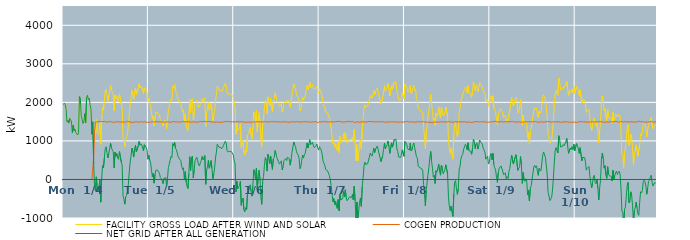
| Category | FACILITY GROSS LOAD AFTER WIND AND SOLAR | COGEN PRODUCTION | NET GRID AFTER ALL GENERATION |
|---|---|---|---|
|  Mon  1/4 | 1943 | 0 | 1943 |
|  Mon  1/4 | 1981 | 0 | 1981 |
|  Mon  1/4 | 1942 | 0 | 1942 |
|  Mon  1/4 | 1819 | 0 | 1819 |
|  Mon  1/4 | 1489 | 0 | 1489 |
|  Mon  1/4 | 1533 | 0 | 1533 |
|  Mon  1/4 | 1461 | 0 | 1461 |
|  Mon  1/4 | 1584 | 0 | 1584 |
|  Mon  1/4 | 1547 | 0 | 1547 |
|  Mon  1/4 | 1512 | 0 | 1512 |
|  Mon  1/4 | 1209 | 0 | 1209 |
|  Mon  1/4 | 1408 | 0 | 1408 |
|  Mon  1/4 | 1260 | 0 | 1260 |
|  Mon  1/4 | 1304 | 0 | 1304 |
|  Mon  1/4 | 1218 | 0 | 1218 |
|  Mon  1/4 | 1212 | 0 | 1212 |
|  Mon  1/4 | 1155 | 0 | 1155 |
|  Mon  1/4 | 1210 | 0 | 1210 |
|  Mon  1/4 | 2149 | 0 | 2149 |
|  Mon  1/4 | 2100 | 0 | 2100 |
|  Mon  1/4 | 1655 | 0 | 1655 |
|  Mon  1/4 | 1634 | 0 | 1634 |
|  Mon  1/4 | 1451 | 0 | 1451 |
|  Mon  1/4 | 1500 | 0 | 1500 |
|  Mon  1/4 | 1708 | 0 | 1708 |
|  Mon  1/4 | 1472 | 0 | 1472 |
|  Mon  1/4 | 2118 | 0 | 2118 |
|  Mon  1/4 | 2185 | 0 | 2185 |
|  Mon  1/4 | 2074 | 0 | 2074 |
|  Mon  1/4 | 2108 | 0 | 2108 |
|  Mon  1/4 | 1933 | 0 | 1933 |
|  Mon  1/4 | 1821 | 0 | 1821 |
|  Mon  1/4 | 1171 | 0 | 1171 |
|  Mon  1/4 | 1495 | 0 | 1495 |
|  Mon  1/4 | 968 | 569 | 399 |
|  Mon  1/4 | 1035 | 1241 | -206 |
|  Mon  1/4 | 1197 | 1493 | -296 |
|  Mon  1/4 | 1559 | 1492 | 67 |
|  Mon  1/4 | 1215 | 1492 | -277 |
|  Mon  1/4 | 1163 | 1483 | -320 |
|  Mon  1/4 | 1201 | 1503 | -302 |
|  Mon  1/4 | 1474 | 1488 | -14 |
|  Mon  1/4 | 913 | 1502 | -589 |
|  Mon  1/4 | 1516 | 1486 | 30 |
|  Mon  1/4 | 1859 | 1499 | 360 |
|  Mon  1/4 | 1804 | 1495 | 309 |
|  Mon  1/4 | 2060 | 1506 | 554 |
|  Mon  1/4 | 2291 | 1493 | 798 |
|  Mon  1/4 | 2342 | 1494 | 848 |
|  Mon  1/4 | 2186 | 1491 | 695 |
|  Mon  1/4 | 2044 | 1485 | 559 |
|  Mon  1/4 | 2167 | 1493 | 674 |
|  Mon  1/4 | 2313 | 1506 | 807 |
|  Mon  1/4 | 2437 | 1499 | 938 |
|  Mon  1/4 | 2317 | 1494 | 823 |
|  Mon  1/4 | 2259 | 1501 | 758 |
|  Mon  1/4 | 2210 | 1481 | 729 |
|  Mon  1/4 | 1786 | 1488 | 298 |
|  Mon  1/4 | 2192 | 1487 | 705 |
|  Mon  1/4 | 2101 | 1500 | 601 |
|  Mon  1/4 | 2171 | 1499 | 672 |
|  Mon  1/4 | 2043 | 1483 | 560 |
|  Mon  1/4 | 2013 | 1493 | 520 |
|  Mon  1/4 | 2217 | 1494 | 723 |
|  Mon  1/4 | 2227 | 1486 | 741 |
|  Mon  1/4 | 1943 | 1489 | 454 |
|  Mon  1/4 | 1866 | 1492 | 374 |
|  Mon  1/4 | 1063 | 1482 | -419 |
|  Mon  1/4 | 987 | 1490 | -503 |
|  Mon  1/4 | 854 | 1495 | -641 |
|  Mon  1/4 | 1037 | 1487 | -450 |
|  Mon  1/4 | 1081 | 1492 | -411 |
|  Mon  1/4 | 1192 | 1508 | -316 |
|  Mon  1/4 | 1377 | 1499 | -122 |
|  Mon  1/4 | 1683 | 1494 | 189 |
|  Mon  1/4 | 1945 | 1502 | 443 |
|  Mon  1/4 | 2094 | 1487 | 607 |
|  Mon  1/4 | 2314 | 1498 | 816 |
|  Mon  1/4 | 2200 | 1480 | 720 |
|  Mon  1/4 | 2082 | 1501 | 581 |
|  Mon  1/4 | 2287 | 1489 | 798 |
|  Mon  1/4 | 2370 | 1485 | 885 |
|  Mon  1/4 | 2208 | 1496 | 712 |
|  Mon  1/4 | 2210 | 1483 | 727 |
|  Mon  1/4 | 2348 | 1481 | 867 |
|  Mon  1/4 | 2483 | 1494 | 989 |
|  Mon  1/4 | 2385 | 1497 | 888 |
|  Mon  1/4 | 2424 | 1495 | 929 |
|  Mon  1/4 | 2398 | 1497 | 901 |
|  Mon  1/4 | 2387 | 1491 | 896 |
|  Mon  1/4 | 2230 | 1488 | 742 |
|  Mon  1/4 | 2383 | 1482 | 901 |
|  Mon  1/4 | 2368 | 1497 | 871 |
|  Mon  1/4 | 2318 | 1488 | 830 |
|  Mon  1/4 | 2249 | 1483 | 766 |
|  Mon  1/4 | 2010 | 1485 | 525 |
|  Tue  1/5 | 2107 | 1483 | 624 |
|  Tue  1/5 | 1995 | 1490 | 505 |
|  Tue  1/5 | 1912 | 1483 | 429 |
|  Tue  1/5 | 1746 | 1492 | 254 |
|  Tue  1/5 | 1574 | 1503 | 71 |
|  Tue  1/5 | 1646 | 1488 | 158 |
|  Tue  1/5 | 1389 | 1485 | -96 |
|  Tue  1/5 | 1621 | 1494 | 127 |
|  Tue  1/5 | 1748 | 1504 | 244 |
|  Tue  1/5 | 1724 | 1488 | 236 |
|  Tue  1/5 | 1736 | 1497 | 239 |
|  Tue  1/5 | 1753 | 1490 | 263 |
|  Tue  1/5 | 1646 | 1490 | 156 |
|  Tue  1/5 | 1551 | 1502 | 49 |
|  Tue  1/5 | 1515 | 1493 | 22 |
|  Tue  1/5 | 1477 | 1497 | -20 |
|  Tue  1/5 | 1382 | 1490 | -108 |
|  Tue  1/5 | 1512 | 1489 | 23 |
|  Tue  1/5 | 1498 | 1486 | 12 |
|  Tue  1/5 | 1541 | 1490 | 51 |
|  Tue  1/5 | 1313 | 1493 | -180 |
|  Tue  1/5 | 1518 | 1496 | 22 |
|  Tue  1/5 | 1808 | 1500 | 308 |
|  Tue  1/5 | 1899 | 1505 | 394 |
|  Tue  1/5 | 1982 | 1480 | 502 |
|  Tue  1/5 | 2091 | 1492 | 599 |
|  Tue  1/5 | 2063 | 1492 | 571 |
|  Tue  1/5 | 2422 | 1492 | 930 |
|  Tue  1/5 | 2372 | 1501 | 871 |
|  Tue  1/5 | 2459 | 1493 | 966 |
|  Tue  1/5 | 2305 | 1495 | 810 |
|  Tue  1/5 | 2256 | 1484 | 772 |
|  Tue  1/5 | 2181 | 1492 | 689 |
|  Tue  1/5 | 2064 | 1473 | 591 |
|  Tue  1/5 | 2064 | 1489 | 575 |
|  Tue  1/5 | 2012 | 1493 | 519 |
|  Tue  1/5 | 1974 | 1489 | 485 |
|  Tue  1/5 | 1841 | 1495 | 346 |
|  Tue  1/5 | 1758 | 1500 | 258 |
|  Tue  1/5 | 1806 | 1503 | 303 |
|  Tue  1/5 | 1496 | 1498 | -2 |
|  Tue  1/5 | 1696 | 1494 | 202 |
|  Tue  1/5 | 1420 | 1490 | -70 |
|  Tue  1/5 | 1311 | 1491 | -180 |
|  Tue  1/5 | 1267 | 1502 | -235 |
|  Tue  1/5 | 1651 | 1498 | 153 |
|  Tue  1/5 | 2078 | 1488 | 590 |
|  Tue  1/5 | 1731 | 1498 | 233 |
|  Tue  1/5 | 2054 | 1486 | 568 |
|  Tue  1/5 | 2097 | 1491 | 606 |
|  Tue  1/5 | 1537 | 1497 | 40 |
|  Tue  1/5 | 1743 | 1498 | 245 |
|  Tue  1/5 | 1980 | 1492 | 488 |
|  Tue  1/5 | 1997 | 1496 | 501 |
|  Tue  1/5 | 2059 | 1482 | 577 |
|  Tue  1/5 | 2079 | 1494 | 585 |
|  Tue  1/5 | 1871 | 1489 | 382 |
|  Tue  1/5 | 1848 | 1498 | 350 |
|  Tue  1/5 | 1942 | 1502 | 440 |
|  Tue  1/5 | 1994 | 1500 | 494 |
|  Tue  1/5 | 2093 | 1498 | 595 |
|  Tue  1/5 | 2005 | 1492 | 513 |
|  Tue  1/5 | 2080 | 1510 | 570 |
|  Tue  1/5 | 2117 | 1497 | 620 |
|  Tue  1/5 | 1373 | 1499 | -126 |
|  Tue  1/5 | 1734 | 1498 | 236 |
|  Tue  1/5 | 1831 | 1498 | 333 |
|  Tue  1/5 | 1994 | 1496 | 498 |
|  Tue  1/5 | 1797 | 1506 | 291 |
|  Tue  1/5 | 1858 | 1491 | 367 |
|  Tue  1/5 | 1982 | 1491 | 491 |
|  Tue  1/5 | 1790 | 1502 | 288 |
|  Tue  1/5 | 1513 | 1494 | 19 |
|  Tue  1/5 | 1640 | 1506 | 134 |
|  Tue  1/5 | 1784 | 1485 | 299 |
|  Tue  1/5 | 2048 | 1491 | 557 |
|  Tue  1/5 | 2197 | 1487 | 710 |
|  Tue  1/5 | 2412 | 1500 | 912 |
|  Tue  1/5 | 2429 | 1494 | 935 |
|  Tue  1/5 | 2319 | 1486 | 833 |
|  Tue  1/5 | 2337 | 1482 | 855 |
|  Tue  1/5 | 2318 | 1487 | 831 |
|  Tue  1/5 | 2278 | 1484 | 794 |
|  Tue  1/5 | 2314 | 1487 | 827 |
|  Tue  1/5 | 2376 | 1491 | 885 |
|  Tue  1/5 | 2383 | 1497 | 886 |
|  Tue  1/5 | 2494 | 1500 | 994 |
|  Tue  1/5 | 2440 | 1489 | 951 |
|  Tue  1/5 | 2254 | 1504 | 750 |
|  Tue  1/5 | 2210 | 1495 | 715 |
|  Tue  1/5 | 2214 | 1503 | 711 |
|  Tue  1/5 | 2224 | 1495 | 729 |
|  Tue  1/5 | 2214 | 1490 | 724 |
|  Tue  1/5 | 2203 | 1484 | 719 |
|  Tue  1/5 | 2217 | 1501 | 716 |
|  Tue  1/5 | 2134 | 1500 | 634 |
|  Wed  1/6 | 1971 | 1487 | 484 |
|  Wed  1/6 | 1899 | 1494 | 405 |
|  Wed  1/6 | 1172 | 1497 | -325 |
|  Wed  1/6 | 1456 | 1504 | -48 |
|  Wed  1/6 | 1258 | 1499 | -241 |
|  Wed  1/6 | 1253 | 1481 | -228 |
|  Wed  1/6 | 1337 | 1494 | -157 |
|  Wed  1/6 | 1450 | 1496 | -46 |
|  Wed  1/6 | 825 | 1496 | -671 |
|  Wed  1/6 | 953 | 1492 | -539 |
|  Wed  1/6 | 1012 | 1497 | -485 |
|  Wed  1/6 | 702 | 1493 | -791 |
|  Wed  1/6 | 637 | 1480 | -843 |
|  Wed  1/6 | 762 | 1493 | -731 |
|  Wed  1/6 | 708 | 1487 | -779 |
|  Wed  1/6 | 1150 | 1504 | -354 |
|  Wed  1/6 | 1184 | 1488 | -304 |
|  Wed  1/6 | 1251 | 1495 | -244 |
|  Wed  1/6 | 1348 | 1488 | -140 |
|  Wed  1/6 | 1178 | 1489 | -311 |
|  Wed  1/6 | 1050 | 1483 | -433 |
|  Wed  1/6 | 1342 | 1504 | -162 |
|  Wed  1/6 | 1747 | 1495 | 252 |
|  Wed  1/6 | 1665 | 1494 | 171 |
|  Wed  1/6 | 1488 | 1493 | -5 |
|  Wed  1/6 | 1787 | 1500 | 287 |
|  Wed  1/6 | 1230 | 1498 | -268 |
|  Wed  1/6 | 1580 | 1507 | 73 |
|  Wed  1/6 | 1739 | 1498 | 241 |
|  Wed  1/6 | 1515 | 1494 | 21 |
|  Wed  1/6 | 1049 | 1489 | -440 |
|  Wed  1/6 | 852 | 1498 | -646 |
|  Wed  1/6 | 1440 | 1491 | -51 |
|  Wed  1/6 | 1576 | 1502 | 74 |
|  Wed  1/6 | 1862 | 1501 | 361 |
|  Wed  1/6 | 2052 | 1489 | 563 |
|  Wed  1/6 | 1997 | 1493 | 504 |
|  Wed  1/6 | 1706 | 1490 | 216 |
|  Wed  1/6 | 2143 | 1492 | 651 |
|  Wed  1/6 | 2071 | 1501 | 570 |
|  Wed  1/6 | 1908 | 1495 | 413 |
|  Wed  1/6 | 2108 | 1499 | 609 |
|  Wed  1/6 | 1886 | 1501 | 385 |
|  Wed  1/6 | 1756 | 1496 | 260 |
|  Wed  1/6 | 2034 | 1498 | 536 |
|  Wed  1/6 | 2073 | 1505 | 568 |
|  Wed  1/6 | 2247 | 1496 | 751 |
|  Wed  1/6 | 2155 | 1491 | 664 |
|  Wed  1/6 | 2063 | 1497 | 566 |
|  Wed  1/6 | 2069 | 1487 | 582 |
|  Wed  1/6 | 1943 | 1497 | 446 |
|  Wed  1/6 | 1897 | 1498 | 399 |
|  Wed  1/6 | 1925 | 1481 | 444 |
|  Wed  1/6 | 1962 | 1479 | 483 |
|  Wed  1/6 | 1753 | 1503 | 250 |
|  Wed  1/6 | 1820 | 1489 | 331 |
|  Wed  1/6 | 1977 | 1489 | 488 |
|  Wed  1/6 | 1986 | 1498 | 488 |
|  Wed  1/6 | 2038 | 1495 | 543 |
|  Wed  1/6 | 1981 | 1491 | 490 |
|  Wed  1/6 | 2067 | 1491 | 576 |
|  Wed  1/6 | 2074 | 1486 | 588 |
|  Wed  1/6 | 2019 | 1482 | 537 |
|  Wed  1/6 | 1870 | 1499 | 371 |
|  Wed  1/6 | 2014 | 1494 | 520 |
|  Wed  1/6 | 2202 | 1505 | 697 |
|  Wed  1/6 | 2192 | 1496 | 696 |
|  Wed  1/6 | 2474 | 1502 | 972 |
|  Wed  1/6 | 2390 | 1488 | 902 |
|  Wed  1/6 | 2350 | 1501 | 849 |
|  Wed  1/6 | 2232 | 1501 | 731 |
|  Wed  1/6 | 2156 | 1489 | 667 |
|  Wed  1/6 | 2128 | 1494 | 634 |
|  Wed  1/6 | 2044 | 1493 | 551 |
|  Wed  1/6 | 1777 | 1494 | 283 |
|  Wed  1/6 | 1828 | 1492 | 336 |
|  Wed  1/6 | 1981 | 1485 | 496 |
|  Wed  1/6 | 2124 | 1490 | 634 |
|  Wed  1/6 | 2059 | 1501 | 558 |
|  Wed  1/6 | 2132 | 1489 | 643 |
|  Wed  1/6 | 2182 | 1494 | 688 |
|  Wed  1/6 | 2158 | 1487 | 671 |
|  Wed  1/6 | 2441 | 1493 | 948 |
|  Wed  1/6 | 2327 | 1510 | 817 |
|  Wed  1/6 | 2413 | 1495 | 918 |
|  Wed  1/6 | 2523 | 1493 | 1030 |
|  Wed  1/6 | 2386 | 1483 | 903 |
|  Wed  1/6 | 2426 | 1496 | 930 |
|  Wed  1/6 | 2467 | 1496 | 971 |
|  Wed  1/6 | 2377 | 1492 | 885 |
|  Wed  1/6 | 2321 | 1492 | 829 |
|  Wed  1/6 | 2344 | 1490 | 854 |
|  Wed  1/6 | 2371 | 1501 | 870 |
|  Wed  1/6 | 2422 | 1504 | 918 |
|  Wed  1/6 | 2290 | 1471 | 819 |
|  Wed  1/6 | 2247 | 1487 | 760 |
|  Thu  1/7 | 2349 | 1499 | 850 |
|  Thu  1/7 | 2305 | 1501 | 804 |
|  Thu  1/7 | 2242 | 1487 | 755 |
|  Thu  1/7 | 2140 | 1493 | 647 |
|  Thu  1/7 | 1971 | 1503 | 468 |
|  Thu  1/7 | 1954 | 1490 | 464 |
|  Thu  1/7 | 1856 | 1495 | 361 |
|  Thu  1/7 | 1755 | 1497 | 258 |
|  Thu  1/7 | 1743 | 1495 | 248 |
|  Thu  1/7 | 1722 | 1496 | 226 |
|  Thu  1/7 | 1741 | 1492 | 249 |
|  Thu  1/7 | 1607 | 1504 | 103 |
|  Thu  1/7 | 1494 | 1490 | 4 |
|  Thu  1/7 | 1334 | 1489 | -155 |
|  Thu  1/7 | 1140 | 1499 | -359 |
|  Thu  1/7 | 931 | 1505 | -574 |
|  Thu  1/7 | 989 | 1487 | -498 |
|  Thu  1/7 | 839 | 1487 | -648 |
|  Thu  1/7 | 942 | 1501 | -559 |
|  Thu  1/7 | 796 | 1489 | -693 |
|  Thu  1/7 | 748 | 1501 | -753 |
|  Thu  1/7 | 973 | 1495 | -522 |
|  Thu  1/7 | 699 | 1512 | -813 |
|  Thu  1/7 | 1115 | 1495 | -380 |
|  Thu  1/7 | 963 | 1496 | -533 |
|  Thu  1/7 | 979 | 1491 | -512 |
|  Thu  1/7 | 989 | 1489 | -500 |
|  Thu  1/7 | 1183 | 1487 | -304 |
|  Thu  1/7 | 1045 | 1496 | -451 |
|  Thu  1/7 | 1224 | 1491 | -267 |
|  Thu  1/7 | 1021 | 1491 | -470 |
|  Thu  1/7 | 945 | 1497 | -552 |
|  Thu  1/7 | 935 | 1510 | -575 |
|  Thu  1/7 | 1016 | 1498 | -482 |
|  Thu  1/7 | 1052 | 1500 | -448 |
|  Thu  1/7 | 1023 | 1491 | -468 |
|  Thu  1/7 | 1025 | 1496 | -471 |
|  Thu  1/7 | 1098 | 1486 | -388 |
|  Thu  1/7 | 971 | 1501 | -530 |
|  Thu  1/7 | 1298 | 1475 | -177 |
|  Thu  1/7 | 941 | 1492 | -551 |
|  Thu  1/7 | 485 | 1490 | -1005 |
|  Thu  1/7 | 912 | 1497 | -585 |
|  Thu  1/7 | 478 | 1491 | -1013 |
|  Thu  1/7 | 653 | 1479 | -826 |
|  Thu  1/7 | 890 | 1482 | -592 |
|  Thu  1/7 | 1018 | 1497 | -479 |
|  Thu  1/7 | 791 | 1490 | -699 |
|  Thu  1/7 | 1292 | 1479 | -187 |
|  Thu  1/7 | 1558 | 1499 | 59 |
|  Thu  1/7 | 1846 | 1496 | 350 |
|  Thu  1/7 | 1940 | 1491 | 449 |
|  Thu  1/7 | 1870 | 1480 | 390 |
|  Thu  1/7 | 1858 | 1488 | 370 |
|  Thu  1/7 | 1896 | 1492 | 404 |
|  Thu  1/7 | 1899 | 1507 | 392 |
|  Thu  1/7 | 2067 | 1492 | 575 |
|  Thu  1/7 | 2184 | 1500 | 684 |
|  Thu  1/7 | 2206 | 1501 | 705 |
|  Thu  1/7 | 2107 | 1502 | 605 |
|  Thu  1/7 | 2195 | 1498 | 697 |
|  Thu  1/7 | 2302 | 1494 | 808 |
|  Thu  1/7 | 2200 | 1501 | 699 |
|  Thu  1/7 | 2281 | 1493 | 788 |
|  Thu  1/7 | 2271 | 1490 | 781 |
|  Thu  1/7 | 2367 | 1498 | 869 |
|  Thu  1/7 | 2382 | 1490 | 892 |
|  Thu  1/7 | 2162 | 1494 | 668 |
|  Thu  1/7 | 2139 | 1488 | 651 |
|  Thu  1/7 | 1960 | 1499 | 461 |
|  Thu  1/7 | 1965 | 1500 | 465 |
|  Thu  1/7 | 2115 | 1500 | 615 |
|  Thu  1/7 | 2272 | 1493 | 779 |
|  Thu  1/7 | 2430 | 1484 | 946 |
|  Thu  1/7 | 2290 | 1495 | 795 |
|  Thu  1/7 | 2302 | 1487 | 815 |
|  Thu  1/7 | 2386 | 1485 | 901 |
|  Thu  1/7 | 2490 | 1491 | 999 |
|  Thu  1/7 | 2346 | 1490 | 856 |
|  Thu  1/7 | 2164 | 1488 | 676 |
|  Thu  1/7 | 2188 | 1490 | 698 |
|  Thu  1/7 | 2446 | 1496 | 950 |
|  Thu  1/7 | 2342 | 1503 | 839 |
|  Thu  1/7 | 2338 | 1497 | 841 |
|  Thu  1/7 | 2524 | 1491 | 1033 |
|  Thu  1/7 | 2535 | 1488 | 1047 |
|  Thu  1/7 | 2532 | 1491 | 1041 |
|  Thu  1/7 | 2283 | 1491 | 792 |
|  Thu  1/7 | 2213 | 1490 | 723 |
|  Thu  1/7 | 2070 | 1487 | 583 |
|  Thu  1/7 | 2077 | 1498 | 579 |
|  Thu  1/7 | 2062 | 1494 | 568 |
|  Thu  1/7 | 2120 | 1489 | 631 |
|  Thu  1/7 | 2249 | 1482 | 767 |
|  Thu  1/7 | 2238 | 1489 | 749 |
|  Thu  1/7 | 2093 | 1493 | 600 |
|  Fri  1/8 | 2480 | 1492 | 988 |
|  Fri  1/8 | 2470 | 1496 | 974 |
|  Fri  1/8 | 2409 | 1488 | 921 |
|  Fri  1/8 | 2304 | 1506 | 798 |
|  Fri  1/8 | 2266 | 1493 | 773 |
|  Fri  1/8 | 2249 | 1486 | 763 |
|  Fri  1/8 | 2434 | 1491 | 943 |
|  Fri  1/8 | 2231 | 1494 | 737 |
|  Fri  1/8 | 2262 | 1497 | 765 |
|  Fri  1/8 | 2383 | 1496 | 887 |
|  Fri  1/8 | 2441 | 1493 | 948 |
|  Fri  1/8 | 2308 | 1482 | 826 |
|  Fri  1/8 | 2338 | 1500 | 838 |
|  Fri  1/8 | 2082 | 1492 | 590 |
|  Fri  1/8 | 2044 | 1493 | 551 |
|  Fri  1/8 | 1839 | 1495 | 344 |
|  Fri  1/8 | 1845 | 1483 | 362 |
|  Fri  1/8 | 1798 | 1495 | 303 |
|  Fri  1/8 | 1773 | 1495 | 278 |
|  Fri  1/8 | 1768 | 1493 | 275 |
|  Fri  1/8 | 1740 | 1503 | 237 |
|  Fri  1/8 | 1373 | 1502 | -129 |
|  Fri  1/8 | 1121 | 1480 | -359 |
|  Fri  1/8 | 803 | 1485 | -682 |
|  Fri  1/8 | 1211 | 1498 | -287 |
|  Fri  1/8 | 1415 | 1486 | -71 |
|  Fri  1/8 | 1633 | 1500 | 133 |
|  Fri  1/8 | 1793 | 1484 | 309 |
|  Fri  1/8 | 2067 | 1507 | 560 |
|  Fri  1/8 | 2211 | 1483 | 728 |
|  Fri  1/8 | 1950 | 1484 | 466 |
|  Fri  1/8 | 1767 | 1473 | 294 |
|  Fri  1/8 | 1546 | 1487 | 59 |
|  Fri  1/8 | 1595 | 1486 | 109 |
|  Fri  1/8 | 1390 | 1496 | -106 |
|  Fri  1/8 | 1725 | 1495 | 230 |
|  Fri  1/8 | 1687 | 1498 | 189 |
|  Fri  1/8 | 1653 | 1485 | 168 |
|  Fri  1/8 | 1879 | 1481 | 398 |
|  Fri  1/8 | 1705 | 1492 | 213 |
|  Fri  1/8 | 1598 | 1487 | 111 |
|  Fri  1/8 | 1861 | 1494 | 367 |
|  Fri  1/8 | 1811 | 1500 | 311 |
|  Fri  1/8 | 1644 | 1496 | 148 |
|  Fri  1/8 | 1670 | 1499 | 171 |
|  Fri  1/8 | 1745 | 1494 | 251 |
|  Fri  1/8 | 1878 | 1498 | 380 |
|  Fri  1/8 | 1879 | 1485 | 394 |
|  Fri  1/8 | 1638 | 1492 | 146 |
|  Fri  1/8 | 1035 | 1504 | -469 |
|  Fri  1/8 | 791 | 1491 | -700 |
|  Fri  1/8 | 680 | 1491 | -811 |
|  Fri  1/8 | 804 | 1493 | -689 |
|  Fri  1/8 | 812 | 1489 | -677 |
|  Fri  1/8 | 529 | 1487 | -958 |
|  Fri  1/8 | 1111 | 1484 | -373 |
|  Fri  1/8 | 1427 | 1498 | -71 |
|  Fri  1/8 | 1471 | 1500 | -29 |
|  Fri  1/8 | 1237 | 1488 | -251 |
|  Fri  1/8 | 1105 | 1492 | -387 |
|  Fri  1/8 | 1245 | 1494 | -249 |
|  Fri  1/8 | 1744 | 1492 | 252 |
|  Fri  1/8 | 1837 | 1503 | 334 |
|  Fri  1/8 | 2037 | 1500 | 537 |
|  Fri  1/8 | 2118 | 1500 | 618 |
|  Fri  1/8 | 2135 | 1489 | 646 |
|  Fri  1/8 | 2276 | 1492 | 784 |
|  Fri  1/8 | 2339 | 1499 | 840 |
|  Fri  1/8 | 2402 | 1491 | 911 |
|  Fri  1/8 | 2356 | 1486 | 870 |
|  Fri  1/8 | 2249 | 1482 | 767 |
|  Fri  1/8 | 2436 | 1485 | 951 |
|  Fri  1/8 | 2243 | 1493 | 750 |
|  Fri  1/8 | 2224 | 1492 | 732 |
|  Fri  1/8 | 2216 | 1495 | 721 |
|  Fri  1/8 | 2133 | 1479 | 654 |
|  Fri  1/8 | 2275 | 1482 | 793 |
|  Fri  1/8 | 2529 | 1490 | 1039 |
|  Fri  1/8 | 2478 | 1494 | 984 |
|  Fri  1/8 | 2293 | 1495 | 798 |
|  Fri  1/8 | 2412 | 1492 | 920 |
|  Fri  1/8 | 2457 | 1504 | 953 |
|  Fri  1/8 | 2281 | 1493 | 788 |
|  Fri  1/8 | 2350 | 1491 | 859 |
|  Fri  1/8 | 2513 | 1490 | 1023 |
|  Fri  1/8 | 2529 | 1491 | 1038 |
|  Fri  1/8 | 2429 | 1476 | 953 |
|  Fri  1/8 | 2417 | 1502 | 915 |
|  Fri  1/8 | 2311 | 1495 | 816 |
|  Fri  1/8 | 2295 | 1490 | 805 |
|  Fri  1/8 | 2209 | 1499 | 710 |
|  Fri  1/8 | 2019 | 1494 | 525 |
|  Fri  1/8 | 2037 | 1504 | 533 |
|  Fri  1/8 | 2082 | 1482 | 600 |
|  Fri  1/8 | 1897 | 1498 | 399 |
|  Fri  1/8 | 1930 | 1490 | 440 |
|  Sat  1/9 | 2130 | 1498 | 632 |
|  Sat  1/9 | 2167 | 1492 | 675 |
|  Sat  1/9 | 1998 | 1493 | 505 |
|  Sat  1/9 | 2171 | 1497 | 674 |
|  Sat  1/9 | 1875 | 1486 | 389 |
|  Sat  1/9 | 1812 | 1510 | 302 |
|  Sat  1/9 | 1752 | 1504 | 248 |
|  Sat  1/9 | 1556 | 1498 | 58 |
|  Sat  1/9 | 1412 | 1486 | -74 |
|  Sat  1/9 | 1663 | 1489 | 174 |
|  Sat  1/9 | 1774 | 1484 | 290 |
|  Sat  1/9 | 1809 | 1497 | 312 |
|  Sat  1/9 | 1839 | 1487 | 352 |
|  Sat  1/9 | 1836 | 1501 | 335 |
|  Sat  1/9 | 1722 | 1502 | 220 |
|  Sat  1/9 | 1613 | 1487 | 126 |
|  Sat  1/9 | 1613 | 1481 | 132 |
|  Sat  1/9 | 1668 | 1500 | 168 |
|  Sat  1/9 | 1519 | 1499 | 20 |
|  Sat  1/9 | 1569 | 1495 | 74 |
|  Sat  1/9 | 1523 | 1496 | 27 |
|  Sat  1/9 | 1712 | 1497 | 215 |
|  Sat  1/9 | 1780 | 1495 | 285 |
|  Sat  1/9 | 1972 | 1498 | 474 |
|  Sat  1/9 | 2129 | 1500 | 629 |
|  Sat  1/9 | 2152 | 1505 | 647 |
|  Sat  1/9 | 1908 | 1509 | 399 |
|  Sat  1/9 | 1909 | 1490 | 419 |
|  Sat  1/9 | 2075 | 1493 | 582 |
|  Sat  1/9 | 2133 | 1491 | 642 |
|  Sat  1/9 | 2106 | 1488 | 618 |
|  Sat  1/9 | 1730 | 1493 | 237 |
|  Sat  1/9 | 1744 | 1486 | 258 |
|  Sat  1/9 | 1823 | 1489 | 334 |
|  Sat  1/9 | 2086 | 1493 | 593 |
|  Sat  1/9 | 1871 | 1484 | 387 |
|  Sat  1/9 | 1401 | 1503 | -102 |
|  Sat  1/9 | 1670 | 1489 | 181 |
|  Sat  1/9 | 1463 | 1483 | -20 |
|  Sat  1/9 | 1448 | 1501 | -53 |
|  Sat  1/9 | 1504 | 1489 | 15 |
|  Sat  1/9 | 1445 | 1492 | -47 |
|  Sat  1/9 | 1085 | 1486 | -401 |
|  Sat  1/9 | 1218 | 1497 | -279 |
|  Sat  1/9 | 933 | 1490 | -557 |
|  Sat  1/9 | 1262 | 1497 | -235 |
|  Sat  1/9 | 1333 | 1493 | -160 |
|  Sat  1/9 | 1323 | 1494 | -171 |
|  Sat  1/9 | 1654 | 1492 | 162 |
|  Sat  1/9 | 1824 | 1497 | 327 |
|  Sat  1/9 | 1866 | 1500 | 366 |
|  Sat  1/9 | 1812 | 1505 | 307 |
|  Sat  1/9 | 1852 | 1497 | 355 |
|  Sat  1/9 | 1703 | 1489 | 214 |
|  Sat  1/9 | 1609 | 1501 | 108 |
|  Sat  1/9 | 1772 | 1482 | 290 |
|  Sat  1/9 | 1759 | 1499 | 260 |
|  Sat  1/9 | 1724 | 1497 | 227 |
|  Sat  1/9 | 1922 | 1495 | 427 |
|  Sat  1/9 | 2121 | 1484 | 637 |
|  Sat  1/9 | 2197 | 1483 | 714 |
|  Sat  1/9 | 2193 | 1495 | 698 |
|  Sat  1/9 | 2078 | 1503 | 575 |
|  Sat  1/9 | 1862 | 1493 | 369 |
|  Sat  1/9 | 1647 | 1505 | 142 |
|  Sat  1/9 | 1173 | 1508 | -335 |
|  Sat  1/9 | 1073 | 1502 | -429 |
|  Sat  1/9 | 939 | 1489 | -550 |
|  Sat  1/9 | 971 | 1484 | -513 |
|  Sat  1/9 | 1028 | 1492 | -464 |
|  Sat  1/9 | 1221 | 1493 | -272 |
|  Sat  1/9 | 1532 | 1497 | 35 |
|  Sat  1/9 | 1914 | 1491 | 423 |
|  Sat  1/9 | 2239 | 1490 | 749 |
|  Sat  1/9 | 2310 | 1483 | 827 |
|  Sat  1/9 | 2237 | 1496 | 741 |
|  Sat  1/9 | 2184 | 1496 | 688 |
|  Sat  1/9 | 2631 | 1497 | 1134 |
|  Sat  1/9 | 2542 | 1494 | 1048 |
|  Sat  1/9 | 2320 | 1478 | 842 |
|  Sat  1/9 | 2329 | 1489 | 840 |
|  Sat  1/9 | 2347 | 1492 | 855 |
|  Sat  1/9 | 2402 | 1499 | 903 |
|  Sat  1/9 | 2368 | 1492 | 876 |
|  Sat  1/9 | 2378 | 1503 | 875 |
|  Sat  1/9 | 2479 | 1498 | 981 |
|  Sat  1/9 | 2547 | 1484 | 1063 |
|  Sat  1/9 | 2362 | 1489 | 873 |
|  Sat  1/9 | 2178 | 1500 | 678 |
|  Sat  1/9 | 2187 | 1484 | 703 |
|  Sat  1/9 | 2305 | 1490 | 815 |
|  Sat  1/9 | 2255 | 1480 | 775 |
|  Sat  1/9 | 2347 | 1493 | 854 |
|  Sat  1/9 | 2264 | 1488 | 776 |
|  Sat  1/9 | 2415 | 1501 | 914 |
|  Sat  1/9 | 2232 | 1488 | 744 |
|  Sun  1/10 | 2254 | 1488 | 766 |
|  Sun  1/10 | 2409 | 1478 | 931 |
|  Sun  1/10 | 2367 | 1484 | 883 |
|  Sun  1/10 | 2288 | 1487 | 801 |
|  Sun  1/10 | 2179 | 1501 | 678 |
|  Sun  1/10 | 2326 | 1503 | 823 |
|  Sun  1/10 | 2327 | 1491 | 836 |
|  Sun  1/10 | 1981 | 1494 | 487 |
|  Sun  1/10 | 2065 | 1491 | 574 |
|  Sun  1/10 | 2092 | 1496 | 596 |
|  Sun  1/10 | 2068 | 1502 | 566 |
|  Sun  1/10 | 1956 | 1492 | 464 |
|  Sun  1/10 | 1739 | 1496 | 243 |
|  Sun  1/10 | 1774 | 1486 | 288 |
|  Sun  1/10 | 1792 | 1491 | 301 |
|  Sun  1/10 | 1822 | 1487 | 335 |
|  Sun  1/10 | 1588 | 1500 | 88 |
|  Sun  1/10 | 1404 | 1492 | -88 |
|  Sun  1/10 | 1279 | 1497 | -218 |
|  Sun  1/10 | 1412 | 1498 | -86 |
|  Sun  1/10 | 1554 | 1489 | 65 |
|  Sun  1/10 | 1599 | 1491 | 108 |
|  Sun  1/10 | 1417 | 1503 | -86 |
|  Sun  1/10 | 1376 | 1490 | -114 |
|  Sun  1/10 | 1496 | 1493 | 3 |
|  Sun  1/10 | 1263 | 1497 | -234 |
|  Sun  1/10 | 950 | 1484 | -534 |
|  Sun  1/10 | 1287 | 1501 | -214 |
|  Sun  1/10 | 1481 | 1503 | -22 |
|  Sun  1/10 | 2018 | 1495 | 523 |
|  Sun  1/10 | 2173 | 1486 | 687 |
|  Sun  1/10 | 2033 | 1493 | 540 |
|  Sun  1/10 | 1782 | 1488 | 294 |
|  Sun  1/10 | 1837 | 1481 | 356 |
|  Sun  1/10 | 1615 | 1497 | 118 |
|  Sun  1/10 | 1521 | 1495 | 26 |
|  Sun  1/10 | 1822 | 1490 | 332 |
|  Sun  1/10 | 1627 | 1485 | 142 |
|  Sun  1/10 | 1584 | 1490 | 94 |
|  Sun  1/10 | 1611 | 1499 | 112 |
|  Sun  1/10 | 1579 | 1497 | 82 |
|  Sun  1/10 | 1453 | 1494 | -41 |
|  Sun  1/10 | 1737 | 1497 | 240 |
|  Sun  1/10 | 1502 | 1499 | 3 |
|  Sun  1/10 | 1594 | 1496 | 98 |
|  Sun  1/10 | 1691 | 1508 | 183 |
|  Sun  1/10 | 1707 | 1489 | 218 |
|  Sun  1/10 | 1623 | 1496 | 127 |
|  Sun  1/10 | 1690 | 1500 | 190 |
|  Sun  1/10 | 1697 | 1481 | 216 |
|  Sun  1/10 | 1644 | 1509 | 135 |
|  Sun  1/10 | 1259 | 1484 | -225 |
|  Sun  1/10 | 680 | 1496 | -816 |
|  Sun  1/10 | 643 | 1500 | -857 |
|  Sun  1/10 | 311 | 1499 | -1188 |
|  Sun  1/10 | 723 | 1504 | -781 |
|  Sun  1/10 | 787 | 1498 | -711 |
|  Sun  1/10 | 1061 | 1495 | -434 |
|  Sun  1/10 | 1335 | 1496 | -161 |
|  Sun  1/10 | 1423 | 1497 | -74 |
|  Sun  1/10 | 883 | 1490 | -607 |
|  Sun  1/10 | 918 | 1493 | -575 |
|  Sun  1/10 | 1176 | 1495 | -319 |
|  Sun  1/10 | 1081 | 1497 | -416 |
|  Sun  1/10 | 823 | 1495 | -672 |
|  Sun  1/10 | 376 | 1495 | -1119 |
|  Sun  1/10 | 678 | 1485 | -807 |
|  Sun  1/10 | 746 | 1486 | -740 |
|  Sun  1/10 | 901 | 1494 | -593 |
|  Sun  1/10 | 752 | 1479 | -727 |
|  Sun  1/10 | 604 | 1491 | -887 |
|  Sun  1/10 | 587 | 1518 | -931 |
|  Sun  1/10 | 892 | 1493 | -601 |
|  Sun  1/10 | 1179 | 1497 | -318 |
|  Sun  1/10 | 1131 | 1482 | -351 |
|  Sun  1/10 | 1216 | 1501 | -285 |
|  Sun  1/10 | 1423 | 1487 | -64 |
|  Sun  1/10 | 1468 | 1487 | -19 |
|  Sun  1/10 | 1435 | 1491 | -56 |
|  Sun  1/10 | 1311 | 1485 | -174 |
|  Sun  1/10 | 1107 | 1491 | -384 |
|  Sun  1/10 | 1271 | 1492 | -221 |
|  Sun  1/10 | 1438 | 1488 | -50 |
|  Sun  1/10 | 1476 | 1492 | -16 |
|  Sun  1/10 | 1553 | 1495 | 58 |
|  Sun  1/10 | 1614 | 1505 | 109 |
|  Sun  1/10 | 1411 | 1486 | -75 |
|  Sun  1/10 | 1317 | 1488 | -171 |
|  Sun  1/10 | 1334 | 1496 | -162 |
|  Sun  1/10 | 1416 | 1490 | -74 |
|  Sun  1/10 | 1388 | 1491 | -103 |
|  Sun  1/10 | 1382 | 1498 | -116 |